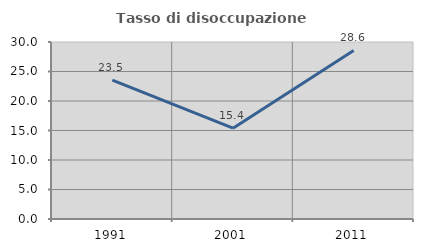
| Category | Tasso di disoccupazione giovanile  |
|---|---|
| 1991.0 | 23.529 |
| 2001.0 | 15.385 |
| 2011.0 | 28.571 |